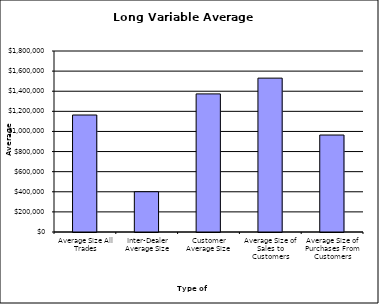
| Category | Security Type |
|---|---|
| Average Size All Trades | 1163529.113 |
| Inter-Dealer Average Size | 400435.673 |
| Customer Average Size | 1373318.468 |
| Average Size of Sales to Customers | 1530246.941 |
| Average Size of Purchases From Customers | 964394.707 |